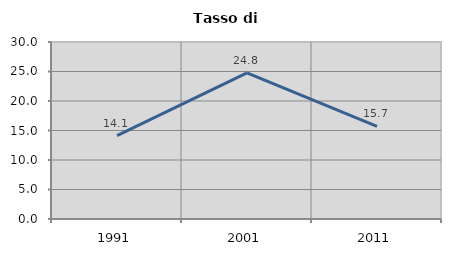
| Category | Tasso di disoccupazione   |
|---|---|
| 1991.0 | 14.118 |
| 2001.0 | 24.779 |
| 2011.0 | 15.686 |